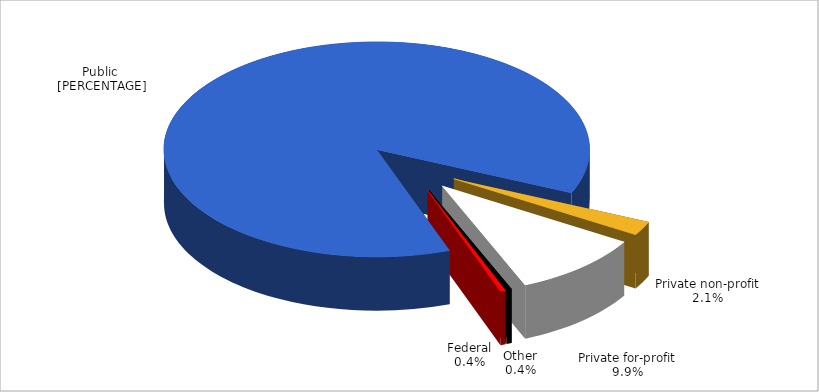
| Category | Series 0 |
|---|---|
| Public | 0.871 |
| Private non-profit | 0.021 |
| Private for-profit | 0.099 |
| Federal | 0.004 |
| Other | 0.004 |